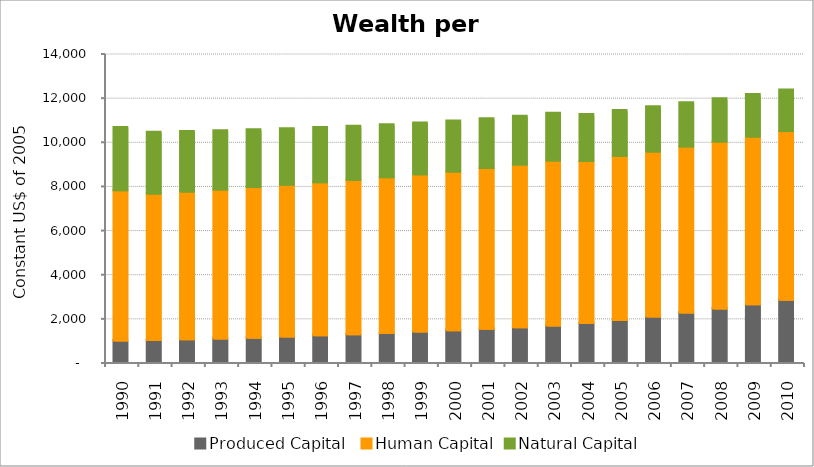
| Category | Produced Capital  | Human Capital | Natural Capital |
|---|---|---|---|
| 1990.0 | 970.581 | 6814.993 | 2842.924 |
| 1991.0 | 998.156 | 6635.407 | 2777.748 |
| 1992.0 | 1028.568 | 6695.489 | 2713.744 |
| 1993.0 | 1060.624 | 6758.973 | 2653.315 |
| 1994.0 | 1100.134 | 6824.655 | 2594.254 |
| 1995.0 | 1155.036 | 6880.37 | 2535.753 |
| 1996.0 | 1206.767 | 6938.888 | 2480.963 |
| 1997.0 | 1256.317 | 7000.14 | 2427.306 |
| 1998.0 | 1311.564 | 7063.296 | 2376.477 |
| 1999.0 | 1377.909 | 7127.426 | 2326.444 |
| 2000.0 | 1438.371 | 7191.56 | 2284.387 |
| 2001.0 | 1503.284 | 7284.971 | 2230.479 |
| 2002.0 | 1572.168 | 7379.656 | 2184.827 |
| 2003.0 | 1657.562 | 7475.199 | 2142.459 |
| 2004.0 | 1770.201 | 7342.219 | 2099.314 |
| 2005.0 | 1905.037 | 7438.213 | 2057.134 |
| 2006.0 | 2061.086 | 7481.082 | 2016.895 |
| 2007.0 | 2245.602 | 7522.174 | 1976.153 |
| 2008.0 | 2423.324 | 7561.81 | 1936.953 |
| 2009.0 | 2614.897 | 7600.62 | 1898.811 |
| 2010.0 | 2822.417 | 7638.866 | 1859.731 |